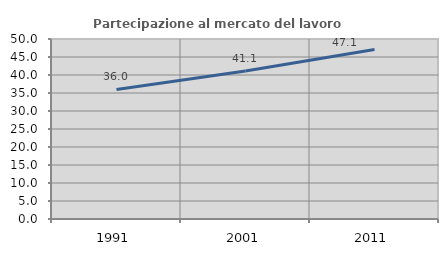
| Category | Partecipazione al mercato del lavoro  femminile |
|---|---|
| 1991.0 | 35.996 |
| 2001.0 | 41.083 |
| 2011.0 | 47.092 |